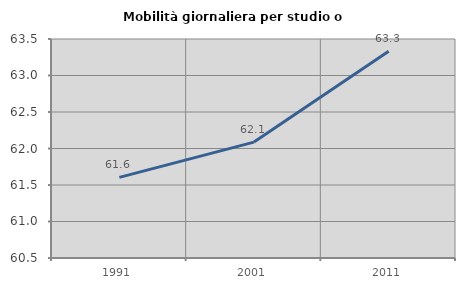
| Category | Mobilità giornaliera per studio o lavoro |
|---|---|
| 1991.0 | 61.605 |
| 2001.0 | 62.088 |
| 2011.0 | 63.331 |